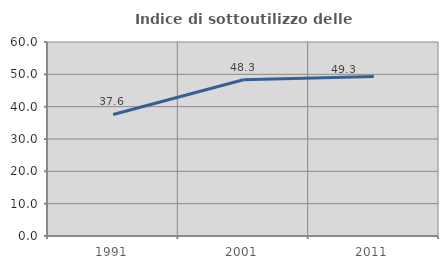
| Category | Indice di sottoutilizzo delle abitazioni  |
|---|---|
| 1991.0 | 37.6 |
| 2001.0 | 48.319 |
| 2011.0 | 49.333 |